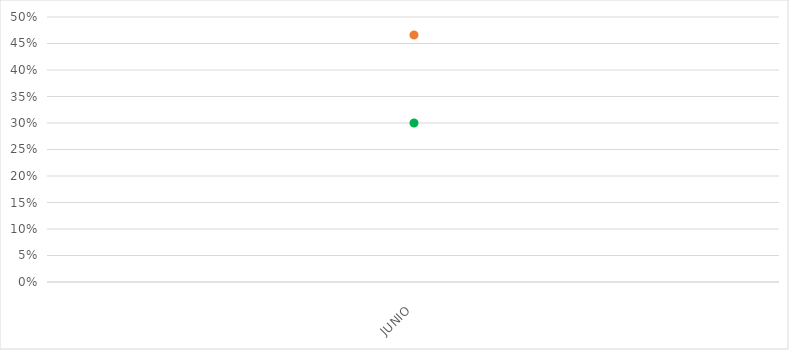
| Category | VALOR  | META PONDERADA |
|---|---|---|
| JUNIO | 0.466 | 0.3 |